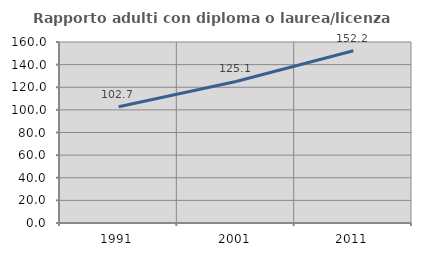
| Category | Rapporto adulti con diploma o laurea/licenza media  |
|---|---|
| 1991.0 | 102.721 |
| 2001.0 | 125.143 |
| 2011.0 | 152.217 |